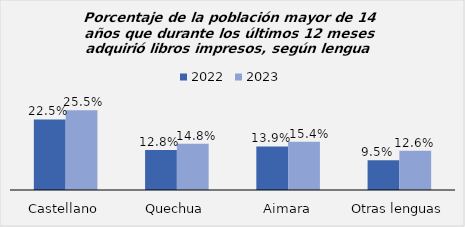
| Category | 2022 | 2023 |
|---|---|---|
| Castellano | 0.225 | 0.255 |
| Quechua | 0.128 | 0.148 |
| Aimara | 0.139 | 0.154 |
| Otras lenguas | 0.095 | 0.126 |